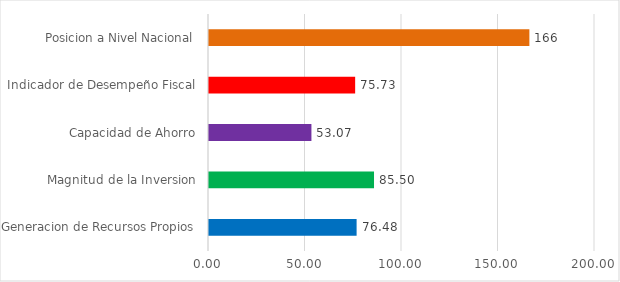
| Category | Series 0 |
|---|---|
| Generacion de Recursos Propios | 76.48 |
| Magnitud de la Inversion | 85.5 |
| Capacidad de Ahorro | 53.07 |
| Indicador de Desempeño Fiscal | 75.73 |
| Posicion a Nivel Nacional | 166 |